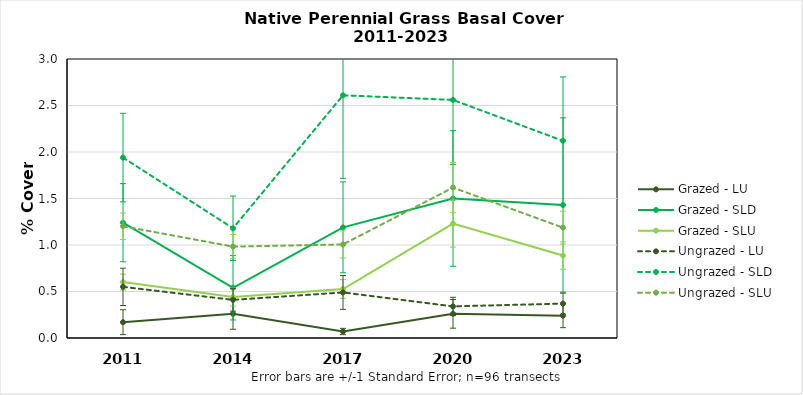
| Category | Grazed - LU | Grazed - SLD | Grazed - SLU | Ungrazed - LU | Ungrazed - SLD | Ungrazed - SLU |
|---|---|---|---|---|---|---|
| 2011.0 | 0.17 | 1.24 | 0.602 | 0.55 | 1.94 | 1.202 |
| 2014.0 | 0.26 | 0.54 | 0.44 | 0.41 | 1.18 | 0.983 |
| 2017.0 | 0.07 | 1.19 | 0.527 | 0.49 | 2.61 | 1.006 |
| 2020.0 | 0.26 | 1.5 | 1.231 | 0.34 | 2.56 | 1.617 |
| 2023.0 | 0.24 | 1.43 | 0.887 | 0.37 | 2.12 | 1.187 |